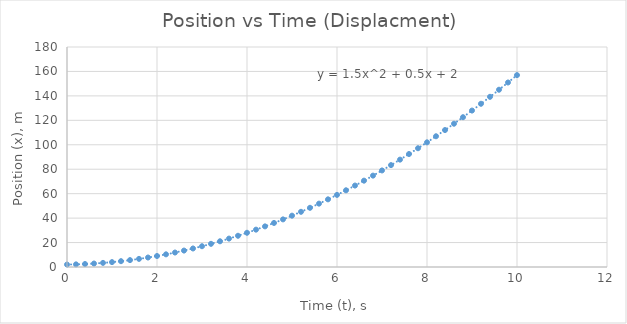
| Category | Series 0 |
|---|---|
| 0.0 | 2 |
| 0.2 | 2.16 |
| 0.4 | 2.44 |
| 0.6 | 2.84 |
| 0.8 | 3.36 |
| 1.0 | 4 |
| 1.2 | 4.76 |
| 1.4 | 5.64 |
| 1.6 | 6.64 |
| 1.8 | 7.76 |
| 2.0 | 9 |
| 2.2 | 10.36 |
| 2.4 | 11.84 |
| 2.6 | 13.44 |
| 2.8 | 15.16 |
| 3.0 | 17 |
| 3.2 | 18.96 |
| 3.4 | 21.04 |
| 3.6 | 23.24 |
| 3.8 | 25.56 |
| 4.0 | 28 |
| 4.2 | 30.56 |
| 4.4 | 33.24 |
| 4.6 | 36.04 |
| 4.8 | 38.96 |
| 5.0 | 42 |
| 5.2 | 45.16 |
| 5.4 | 48.44 |
| 5.6 | 51.84 |
| 5.8 | 55.36 |
| 6.0 | 59 |
| 6.2 | 62.76 |
| 6.4 | 66.64 |
| 6.6 | 70.64 |
| 6.8 | 74.76 |
| 7.0 | 79 |
| 7.2 | 83.36 |
| 7.4 | 87.84 |
| 7.6 | 92.44 |
| 7.8 | 97.16 |
| 8.0 | 102 |
| 8.2 | 106.96 |
| 8.4 | 112.04 |
| 8.6 | 117.24 |
| 8.8 | 122.56 |
| 9.0 | 128 |
| 9.2 | 133.56 |
| 9.4 | 139.24 |
| 9.6 | 145.04 |
| 9.8 | 150.96 |
| 10.0 | 157 |